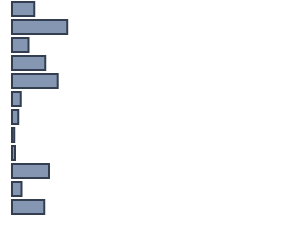
| Category | Series 0 |
|---|---|
| 0 | 8.2 |
| 1 | 20.3 |
| 2 | 6.1 |
| 3 | 12.2 |
| 4 | 16.8 |
| 5 | 3.2 |
| 6 | 2.3 |
| 7 | 0.8 |
| 8 | 1.1 |
| 9 | 13.6 |
| 10 | 3.5 |
| 11 | 11.9 |